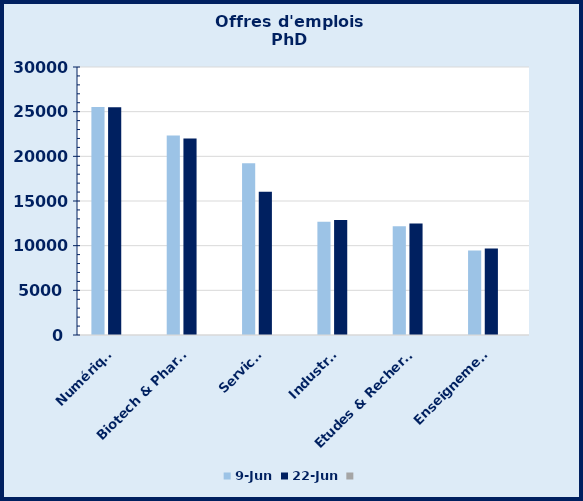
| Category | 09-juin | 22-juin | Series 2 |
|---|---|---|---|
| Numérique | 25513 | 25491 |  |
| Biotech & Pharma | 22327 | 22010 |  |
| Services | 19230 | 16042 |  |
| Industrie | 12678 | 12880 |  |
| Etudes & Recherche | 12186 | 12494 |  |
| Enseignement | 9467 | 9692 |  |